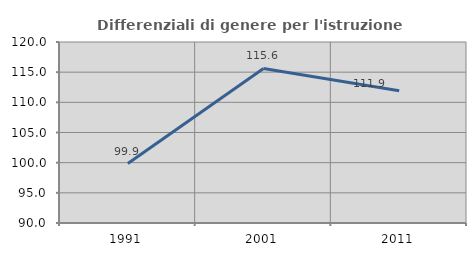
| Category | Differenziali di genere per l'istruzione superiore |
|---|---|
| 1991.0 | 99.85 |
| 2001.0 | 115.621 |
| 2011.0 | 111.925 |